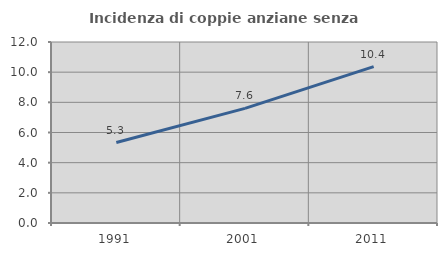
| Category | Incidenza di coppie anziane senza figli  |
|---|---|
| 1991.0 | 5.333 |
| 2001.0 | 7.602 |
| 2011.0 | 10.372 |